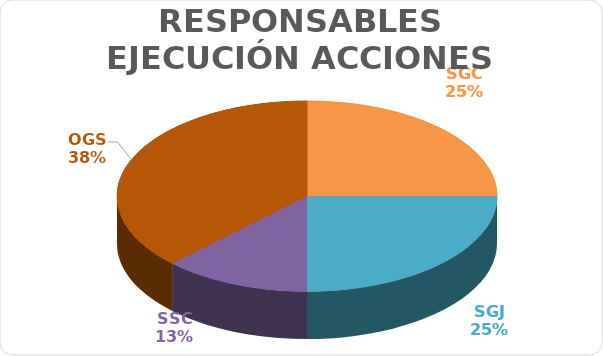
| Category | Series 0 |
|---|---|
| SGC | 2 |
| SGJ | 2 |
| SSC | 1 |
| OGS | 3 |